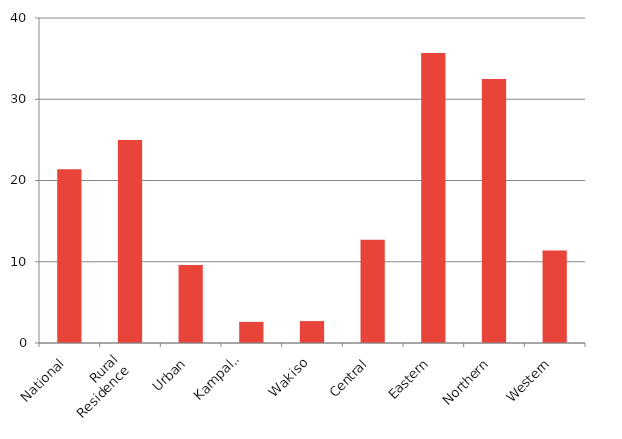
| Category | Poverty Incidence |
|---|---|
| 0 | 21.4 |
| 1 | 25 |
| 2 | 9.6 |
| 3 | 2.6 |
| 4 | 2.7 |
| 5 | 12.7 |
| 6 | 35.7 |
| 7 | 32.5 |
| 8 | 11.4 |